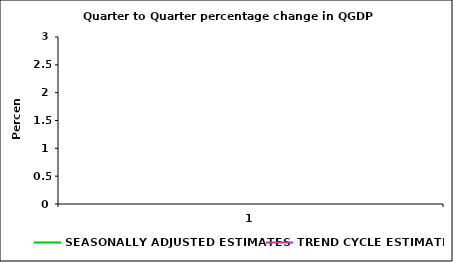
| Category | SEASONALLY ADJUSTED ESTIMATES | TREND CYCLE ESTIMATES |
|---|---|---|
| 0 | 2.854 | 1.926 |